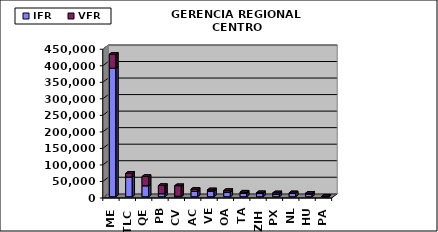
| Category | IFR | VFR |
|---|---|---|
| MEX | 388656 | 42324 |
| TLC | 59515 | 11180 |
| QET | 33238 | 27956 |
| PBC | 9205 | 24714 |
| CVA | 1502 | 31892 |
| ACA | 15909 | 6830 |
| VER | 16934 | 3887 |
| OAX | 14114 | 4851 |
| TAM | 9836 | 4123 |
| ZIH | 9624 | 2565 |
| PXM | 6975 | 4809 |
| NLU | 10996 | 539 |
| HUX | 8220 | 2428 |
| PAZ | 432 | 1312 |